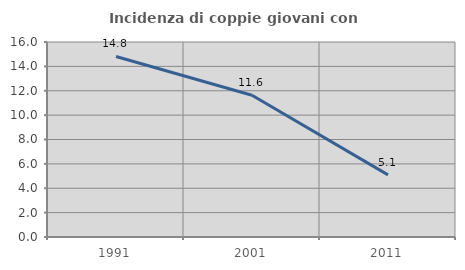
| Category | Incidenza di coppie giovani con figli |
|---|---|
| 1991.0 | 14.815 |
| 2001.0 | 11.628 |
| 2011.0 | 5.096 |